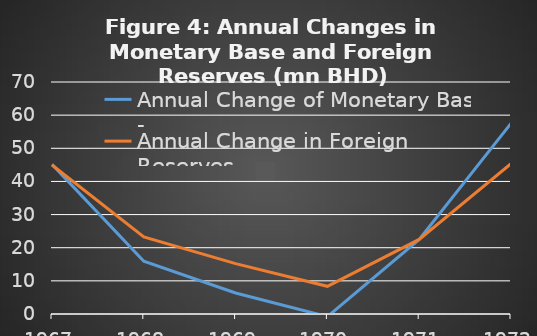
| Category | Annual Change of Monetary Base | Annual Change in Foreign Reserves |
|---|---|---|
| 1967.0 | 45166666.67 | 44957465.13 |
| 1968.0 | 15914285.72 | 23238017.63 |
| 1969.0 | 6350255 | 15194167.55 |
| 1970.0 | -799983 | 8359449.81 |
| 1971.0 | 22499980 | 22495611.07 |
| 1972.0 | 57500048 | 45371902.7 |